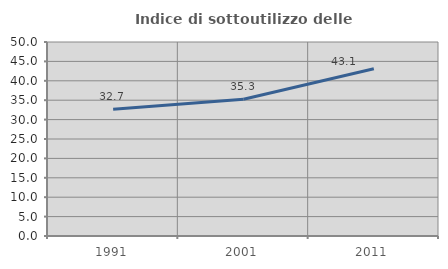
| Category | Indice di sottoutilizzo delle abitazioni  |
|---|---|
| 1991.0 | 32.675 |
| 2001.0 | 35.255 |
| 2011.0 | 43.118 |